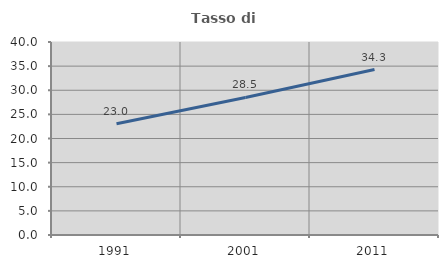
| Category | Tasso di occupazione   |
|---|---|
| 1991.0 | 23.049 |
| 2001.0 | 28.508 |
| 2011.0 | 34.291 |